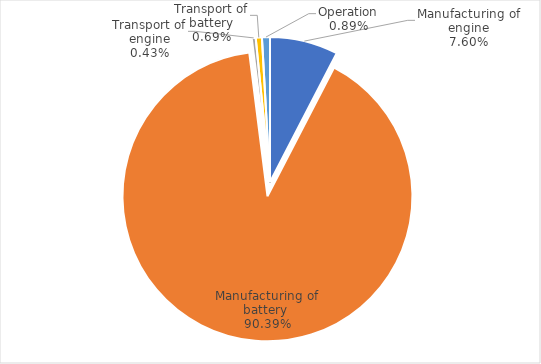
| Category | Series 0 |
|---|---|
| Manufacturing of engine | 5977.113 |
| Manufacturing of battery  | 71055.6 |
| Transport of engine | 341.798 |
| Transport of battery | 540.108 |
| Operation | 698.379 |